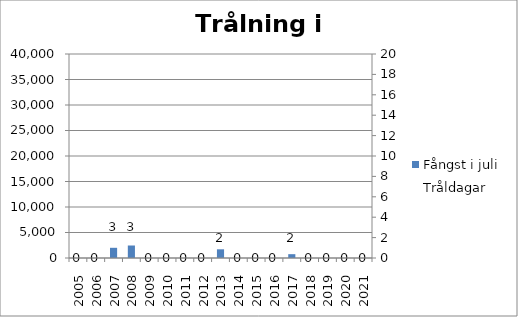
| Category | Fångst i juli |
|---|---|
| 2005.0 | 0 |
| 2006.0 | 0 |
| 2007.0 | 2000 |
| 2008.0 | 2450 |
| 2009.0 | 0 |
| 2010.0 | 0 |
| 2011.0 | 0 |
| 2012.0 | 0 |
| 2013.0 | 1705 |
| 2014.0 | 0 |
| 2015.0 | 0 |
| 2016.0 | 0 |
| 2017.0 | 750 |
| 2018.0 | 0 |
| 2019.0 | 0 |
| 2020.0 | 0 |
| 2021.0 | 0 |